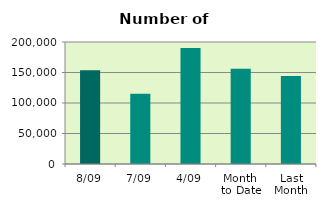
| Category | Series 0 |
|---|---|
| 8/09 | 153494 |
| 7/09 | 115004 |
| 4/09 | 190172 |
| Month 
to Date | 156182.333 |
| Last
Month | 144368.095 |